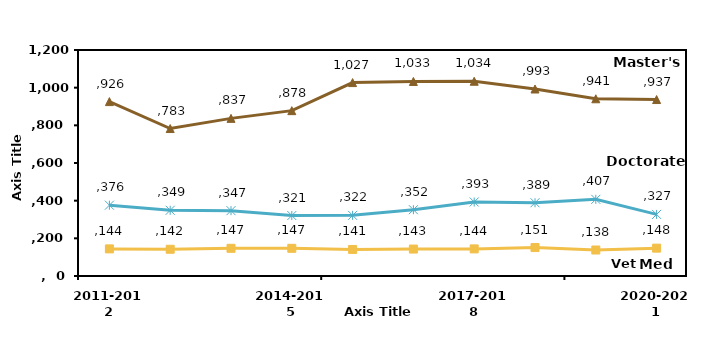
| Category | Series 1 | Series 2 | Series 4 |
|---|---|---|---|
| 2011-2012 | 144 | 926 | 376 |
| 2012-2013 | 142 | 783 | 349 |
| 2013-2014 | 147 | 837 | 347 |
| 2014-2015 | 147 | 878 | 321 |
| 2015-2016 | 141 | 1027 | 322 |
| 2016-2017 | 143 | 1033 | 352 |
| 2017-2018 | 144 | 1034 | 393 |
| 2018-2019 | 151 | 993 | 389 |
| 2019-2020 | 138 | 941 | 407 |
| 2020-2021 | 148 | 937 | 327 |